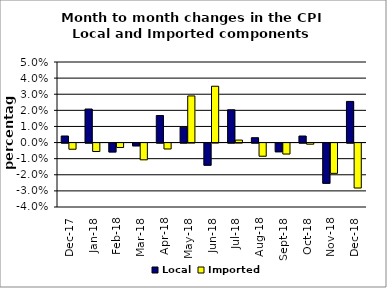
| Category | Local | Imported |
|---|---|---|
| 2017-12-01 | 0.004 | -0.004 |
| 2018-01-01 | 0.021 | -0.005 |
| 2018-02-01 | -0.006 | -0.003 |
| 2018-03-01 | -0.002 | -0.01 |
| 2018-04-01 | 0.017 | -0.004 |
| 2018-05-01 | 0.01 | 0.029 |
| 2018-06-01 | -0.014 | 0.035 |
| 2018-07-01 | 0.02 | 0.002 |
| 2018-08-01 | 0.003 | -0.008 |
| 2018-09-01 | -0.005 | -0.007 |
| 2018-10-01 | 0.004 | -0.001 |
| 2018-11-01 | -0.025 | -0.019 |
| 2018-12-01 | 0.026 | -0.028 |